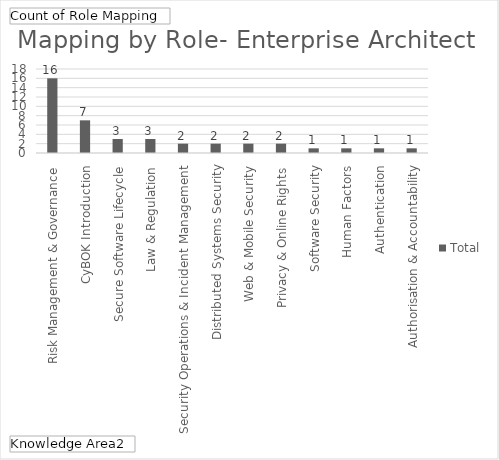
| Category | Total |
|---|---|
| Risk Management & Governance | 16 |
| CyBOK Introduction | 7 |
| Secure Software Lifecycle | 3 |
| Law & Regulation | 3 |
| Security Operations & Incident Management | 2 |
| Distributed Systems Security | 2 |
| Web & Mobile Security | 2 |
| Privacy & Online Rights | 2 |
| Software Security | 1 |
| Human Factors | 1 |
| Authentication, Authorisation & Accountability | 1 |
| Network Security | 1 |